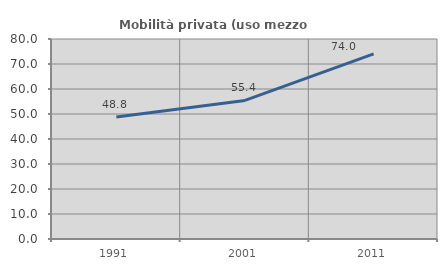
| Category | Mobilità privata (uso mezzo privato) |
|---|---|
| 1991.0 | 48.845 |
| 2001.0 | 55.44 |
| 2011.0 | 74.035 |